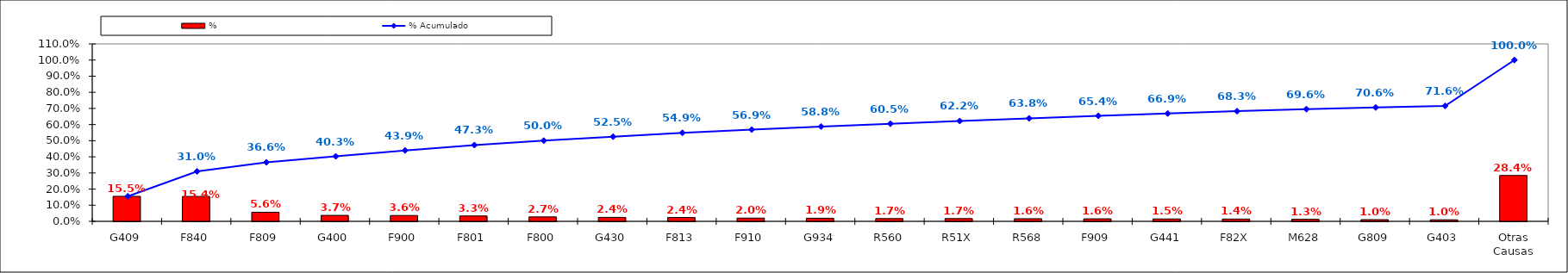
| Category | % |
|---|---|
| G409 | 0.155 |
| F840 | 0.154 |
| F809 | 0.056 |
| G400 | 0.037 |
| F900 | 0.036 |
| F801 | 0.033 |
| F800 | 0.027 |
| G430 | 0.024 |
| F813 | 0.024 |
| F910 | 0.02 |
| G934 | 0.019 |
| R560 | 0.017 |
| R51X | 0.017 |
| R568 | 0.016 |
| F909 | 0.016 |
| G441 | 0.015 |
| F82X | 0.014 |
| M628 | 0.013 |
| G809 | 0.01 |
| G403 | 0.01 |
| Otras Causas | 0.284 |